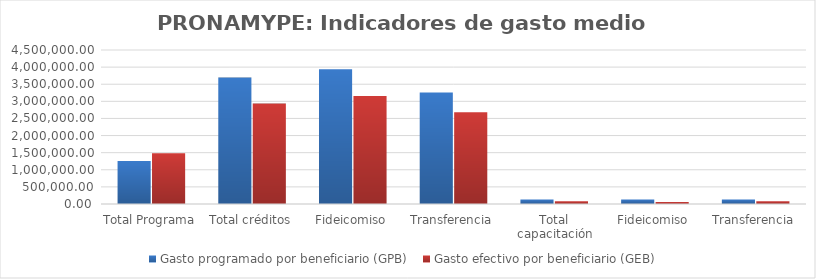
| Category | Gasto programado por beneficiario (GPB)  | Gasto efectivo por beneficiario (GEB)  |
|---|---|---|
| Total Programa | 1256188.962 | 1484598.053 |
| Total créditos | 3693759.071 | 2933305.202 |
| Fideicomiso | 3934611.048 | 3153380.648 |
| Transferencia | 3258655.804 | 2680452.562 |
| Total capacitación | 133675.214 | 80380.952 |
| Fideicomiso | 133666.112 | 57771.681 |
| Transferencia | 133689.84 | 82059.166 |